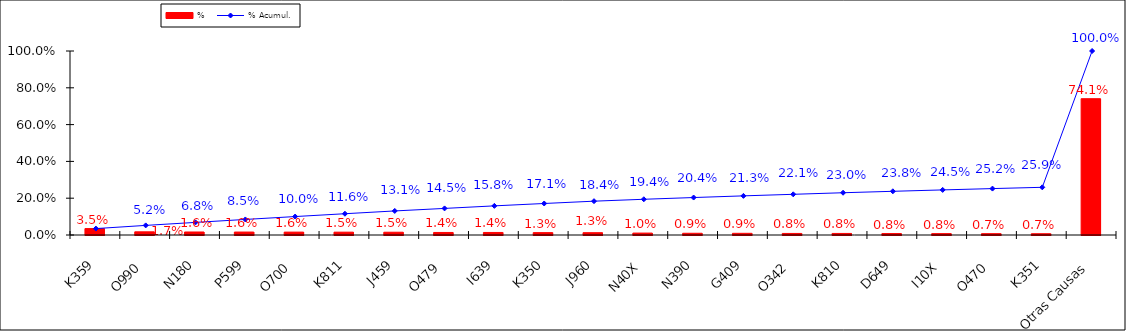
| Category | % |
|---|---|
| K359 | 0.035 |
| O990 | 0.017 |
| N180 | 0.016 |
| P599 | 0.016 |
| O700 | 0.016 |
| K811 | 0.015 |
| J459 | 0.015 |
| O479 | 0.014 |
| I639 | 0.014 |
| K350 | 0.013 |
| J960 | 0.013 |
| N40X | 0.01 |
| N390 | 0.009 |
| G409 | 0.009 |
| O342 | 0.008 |
| K810 | 0.008 |
| D649 | 0.008 |
| I10X | 0.008 |
| O470 | 0.007 |
| K351 | 0.007 |
| Otras Causas | 0.741 |